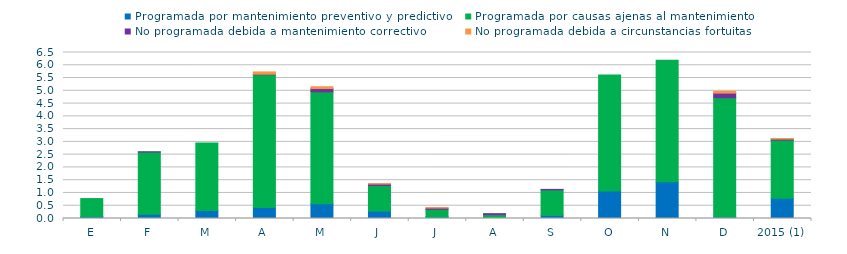
| Category | Programada por mantenimiento preventivo y predictivo | Programada por causas ajenas al mantenimiento  | No programada debida a mantenimiento correctivo  | No programada debida a circunstancias fortuitas  |
|---|---|---|---|---|
| E | 0.08 | 0.7 | 0 | 0 |
| F | 0.17 | 2.43 | 0.01 | 0 |
| M | 0.31 | 2.65 | 0 | 0 |
| A | 0.43 | 5.2 | 0.02 | 0.09 |
| M | 0.58 | 4.38 | 0.13 | 0.07 |
| J | 0.29 | 1 | 0.06 | 0.01 |
| J | 0.07 | 0.29 | 0.05 | 0.01 |
| A | 0 | 0.15 | 0.04 | 0 |
| S | 0.12 | 1 | 0.02 | 0 |
| O | 1.08 | 4.54 | 0 | 0 |
| N | 1.44 | 4.76 | 0 | 0 |
| D | 0.06 | 4.67 | 0.18 | 0.07 |
| 2015 (1) | 0.79 | 2.28 | 0.04 | 0.02 |